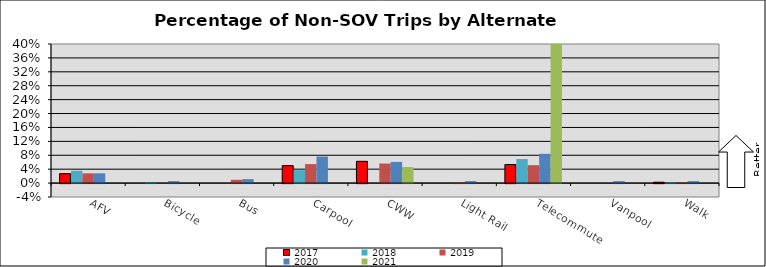
| Category | 2017 | 2018 | 2019 | 2020 | 2021 |
|---|---|---|---|---|---|
| AFV | 0.027 | 0.035 | 0.028 | 0.028 | 0 |
| Bicycle | 0 | 0.003 | 0 | 0.006 | 0 |
| Bus | 0 | 0 | 0.009 | 0.011 | 0 |
| Carpool | 0.05 | 0.037 | 0.055 | 0.076 | 0 |
| CWW | 0.063 | 0 | 0.056 | 0.061 | 0.046 |
| Light Rail | 0 | 0 | 0.001 | 0.006 | 0 |
| Telecommute | 0.053 | 0.069 | 0.051 | 0.084 | 0.85 |
| Vanpool | 0 | 0 | 0 | 0.006 | 0 |
| Walk | 0.002 | 0.003 | 0.001 | 0.006 | 0 |